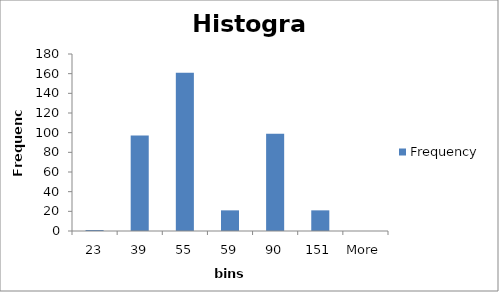
| Category | Frequency |
|---|---|
| 23 | 1 |
| 39 | 97 |
| 55 | 161 |
| 59 | 21 |
| 90 | 99 |
| 151 | 21 |
| More | 0 |